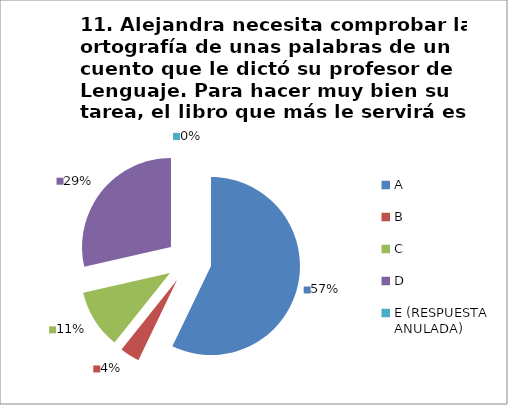
| Category | CANTIDAD DE RESPUESTAS PREGUNTA (11) | PORCENTAJE |
|---|---|---|
| A | 16 | 0.571 |
| B | 1 | 0.036 |
| C | 3 | 0.107 |
| D | 8 | 0.286 |
| E (RESPUESTA ANULADA) | 0 | 0 |